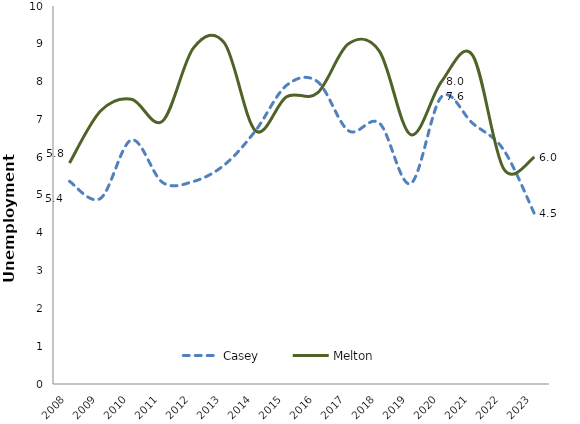
| Category | Casey  | Melton  |
|---|---|---|
| 2008.0 | 5.362 | 5.847 |
| 2009.0 | 4.909 | 7.222 |
| 2010.0 | 6.457 | 7.534 |
| 2011.0 | 5.334 | 6.953 |
| 2012.0 | 5.359 | 8.892 |
| 2013.0 | 5.799 | 9.016 |
| 2014.0 | 6.7 | 6.7 |
| 2015.0 | 7.9 | 7.6 |
| 2016.0 | 8 | 7.7 |
| 2017.0 | 6.7 | 9 |
| 2018.0 | 6.9 | 8.8 |
| 2019.0 | 5.3 | 6.6 |
| 2020.0 | 7.6 | 8 |
| 2021.0 | 6.9 | 8.7 |
| 2022.0 | 6.2 | 5.7 |
| 2023.0 | 4.5 | 6 |